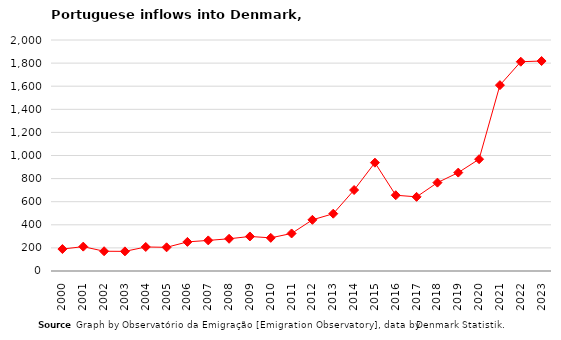
| Category | Entradas |
|---|---|
| 2000.0 | 190 |
| 2001.0 | 211 |
| 2002.0 | 171 |
| 2003.0 | 170 |
| 2004.0 | 208 |
| 2005.0 | 205 |
| 2006.0 | 252 |
| 2007.0 | 265 |
| 2008.0 | 279 |
| 2009.0 | 299 |
| 2010.0 | 287 |
| 2011.0 | 325 |
| 2012.0 | 443 |
| 2013.0 | 496 |
| 2014.0 | 701 |
| 2015.0 | 938 |
| 2016.0 | 656 |
| 2017.0 | 642 |
| 2018.0 | 765 |
| 2019.0 | 852 |
| 2020.0 | 968 |
| 2021.0 | 1609 |
| 2022.0 | 1812 |
| 2023.0 | 1818 |